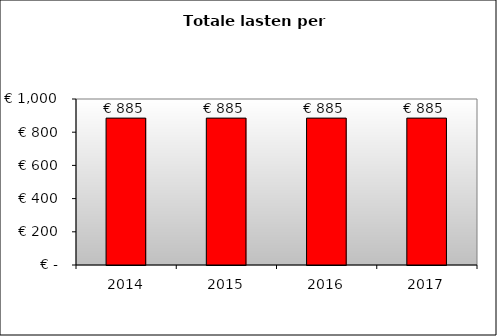
| Category | Series 0 |
|---|---|
| 2014.0 | 884.872 |
| 2015.0 | 884.872 |
| 2016.0 | 884.872 |
| 2017.0 | 884.872 |